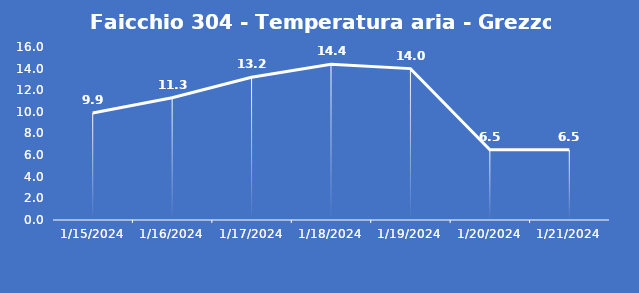
| Category | Faicchio 304 - Temperatura aria - Grezzo (°C) |
|---|---|
| 1/15/24 | 9.9 |
| 1/16/24 | 11.3 |
| 1/17/24 | 13.2 |
| 1/18/24 | 14.4 |
| 1/19/24 | 14 |
| 1/20/24 | 6.5 |
| 1/21/24 | 6.5 |